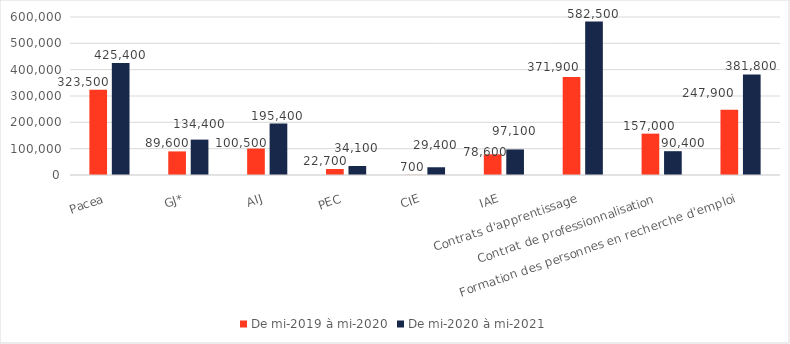
| Category | De mi-2019 à mi-2020 | De mi-2020 à mi-2021 |
|---|---|---|
| Pacea | 323500 | 425400 |
| GJ* | 89600 | 134400 |
| AIJ | 100500 | 195400 |
| PEC | 22700 | 34100 |
| CIE | 700 | 29400 |
| IAE | 78600 | 97100 |
| Contrats d'apprentissage | 371900 | 582500 |
| Contrat de professionnalisation | 157000 | 90400 |
| Formation des personnes en recherche d'emploi | 247900 | 381800 |